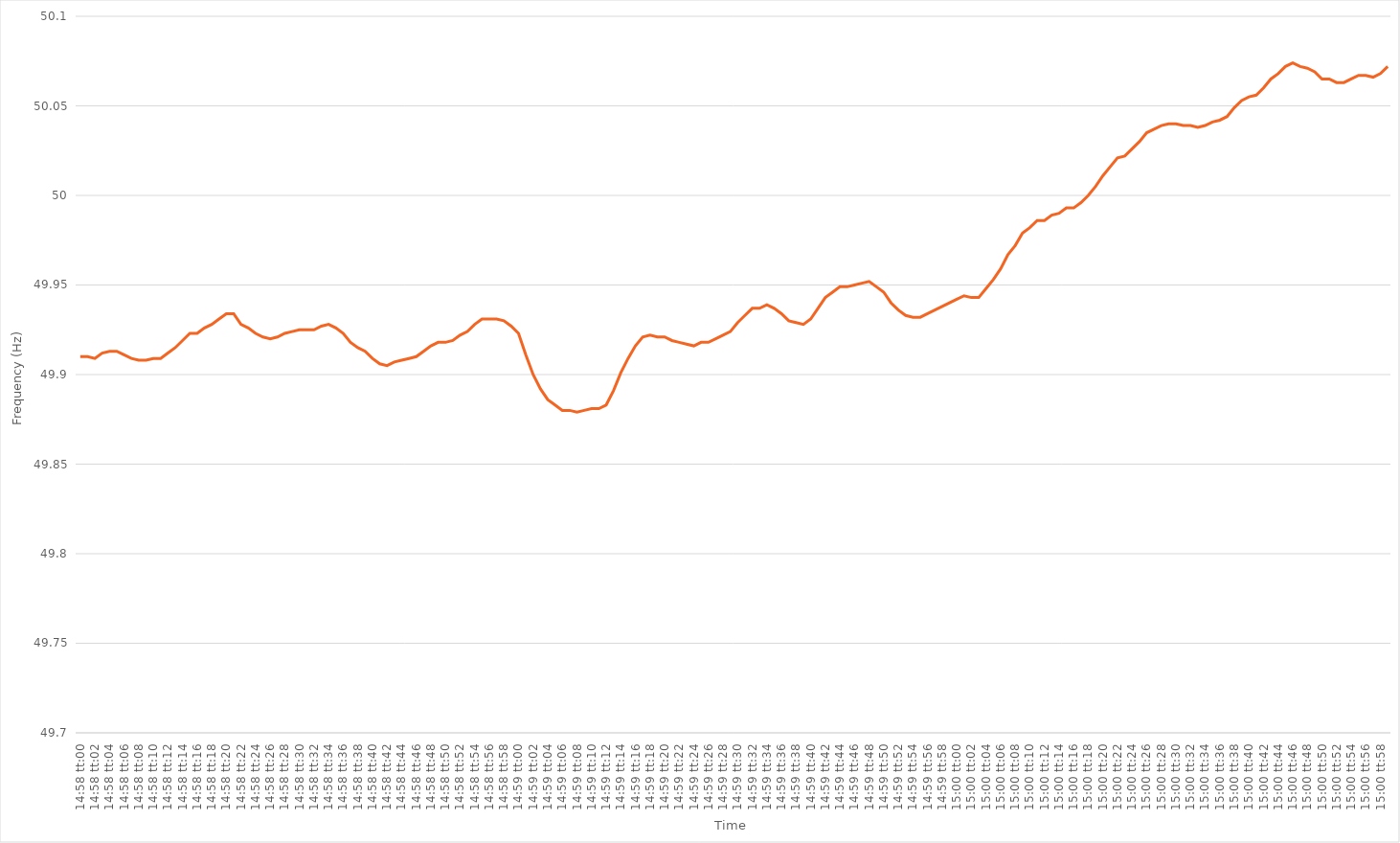
| Category | Series 0 |
|---|---|
| 0.6236111111111111 | 49.91 |
| 0.6236226851851852 | 49.91 |
| 0.6236342592592593 | 49.909 |
| 0.6236458333333333 | 49.912 |
| 0.6236574074074074 | 49.913 |
| 0.6236689814814814 | 49.913 |
| 0.6236805555555556 | 49.911 |
| 0.6236921296296296 | 49.909 |
| 0.6237037037037038 | 49.908 |
| 0.6237152777777778 | 49.908 |
| 0.6237268518518518 | 49.909 |
| 0.6237384259259259 | 49.909 |
| 0.62375 | 49.912 |
| 0.6237615740740741 | 49.915 |
| 0.6237731481481482 | 49.919 |
| 0.6237847222222223 | 49.923 |
| 0.6237962962962963 | 49.923 |
| 0.6238078703703703 | 49.926 |
| 0.6238194444444444 | 49.928 |
| 0.6238310185185185 | 49.931 |
| 0.6238425925925926 | 49.934 |
| 0.6238541666666667 | 49.934 |
| 0.6238657407407407 | 49.928 |
| 0.6238773148148148 | 49.926 |
| 0.6238888888888888 | 49.923 |
| 0.623900462962963 | 49.921 |
| 0.623912037037037 | 49.92 |
| 0.6239236111111112 | 49.921 |
| 0.6239351851851852 | 49.923 |
| 0.6239467592592592 | 49.924 |
| 0.6239583333333333 | 49.925 |
| 0.6239699074074074 | 49.925 |
| 0.6239814814814815 | 49.925 |
| 0.6239930555555556 | 49.927 |
| 0.6240046296296297 | 49.928 |
| 0.6240162037037037 | 49.926 |
| 0.6240277777777777 | 49.923 |
| 0.6240393518518519 | 49.918 |
| 0.6240509259259259 | 49.915 |
| 0.6240625 | 49.913 |
| 0.6240740740740741 | 49.909 |
| 0.6240856481481482 | 49.906 |
| 0.6240972222222222 | 49.905 |
| 0.6241087962962962 | 49.907 |
| 0.6241203703703704 | 49.908 |
| 0.6241319444444444 | 49.909 |
| 0.6241435185185186 | 49.91 |
| 0.6241550925925926 | 49.913 |
| 0.6241666666666666 | 49.916 |
| 0.6241782407407407 | 49.918 |
| 0.6241898148148148 | 49.918 |
| 0.6242013888888889 | 49.919 |
| 0.624212962962963 | 49.922 |
| 0.6242245370370371 | 49.924 |
| 0.6242361111111111 | 49.928 |
| 0.6242476851851851 | 49.931 |
| 0.6242592592592593 | 49.931 |
| 0.6242708333333333 | 49.931 |
| 0.6242824074074075 | 49.93 |
| 0.6242939814814815 | 49.927 |
| 0.6243055555555556 | 49.923 |
| 0.6243171296296296 | 49.911 |
| 0.6243287037037036 | 49.9 |
| 0.6243402777777778 | 49.892 |
| 0.6243518518518518 | 49.886 |
| 0.624363425925926 | 49.883 |
| 0.624375 | 49.88 |
| 0.624386574074074 | 49.88 |
| 0.6243981481481481 | 49.879 |
| 0.6244097222222222 | 49.88 |
| 0.6244212962962963 | 49.881 |
| 0.6244328703703704 | 49.881 |
| 0.6244444444444445 | 49.883 |
| 0.6244560185185185 | 49.891 |
| 0.6244675925925925 | 49.901 |
| 0.6244791666666667 | 49.909 |
| 0.6244907407407407 | 49.916 |
| 0.6245023148148149 | 49.921 |
| 0.6245138888888889 | 49.922 |
| 0.624525462962963 | 49.921 |
| 0.624537037037037 | 49.921 |
| 0.624548611111111 | 49.919 |
| 0.6245601851851852 | 49.918 |
| 0.6245717592592592 | 49.917 |
| 0.6245833333333334 | 49.916 |
| 0.6245949074074074 | 49.918 |
| 0.6246064814814815 | 49.918 |
| 0.6246180555555555 | 49.92 |
| 0.6246296296296296 | 49.922 |
| 0.6246412037037037 | 49.924 |
| 0.6246527777777778 | 49.929 |
| 0.6246643518518519 | 49.933 |
| 0.6246759259259259 | 49.937 |
| 0.6246875 | 49.937 |
| 0.6246990740740741 | 49.939 |
| 0.6247106481481481 | 49.937 |
| 0.6247222222222223 | 49.934 |
| 0.6247337962962963 | 49.93 |
| 0.6247453703703704 | 49.929 |
| 0.6247569444444444 | 49.928 |
| 0.6247685185185184 | 49.931 |
| 0.6247800925925926 | 49.937 |
| 0.6247916666666666 | 49.943 |
| 0.6248032407407408 | 49.946 |
| 0.6248148148148148 | 49.949 |
| 0.6248263888888889 | 49.949 |
| 0.6248379629629629 | 49.95 |
| 0.624849537037037 | 49.951 |
| 0.6248611111111111 | 49.952 |
| 0.6248726851851852 | 49.949 |
| 0.6248842592592593 | 49.946 |
| 0.6248958333333333 | 49.94 |
| 0.6249074074074074 | 49.936 |
| 0.6249189814814815 | 49.933 |
| 0.6249305555555555 | 49.932 |
| 0.6249421296296297 | 49.932 |
| 0.6249537037037037 | 49.934 |
| 0.6249652777777778 | 49.936 |
| 0.6249768518518518 | 49.938 |
| 0.624988425925926 | 49.94 |
| 0.625 | 49.942 |
| 0.625011574074074 | 49.944 |
| 0.6250231481481482 | 49.943 |
| 0.6250347222222222 | 49.943 |
| 0.6250462962962963 | 49.948 |
| 0.6250578703703703 | 49.953 |
| 0.6250694444444445 | 49.959 |
| 0.6250810185185185 | 49.967 |
| 0.6250925925925926 | 49.972 |
| 0.6251041666666667 | 49.979 |
| 0.6251157407407407 | 49.982 |
| 0.6251273148148148 | 49.986 |
| 0.6251388888888889 | 49.986 |
| 0.625150462962963 | 49.989 |
| 0.6251620370370371 | 49.99 |
| 0.6251736111111111 | 49.993 |
| 0.6251851851851852 | 49.993 |
| 0.6251967592592592 | 49.996 |
| 0.6252083333333334 | 50 |
| 0.6252199074074074 | 50.005 |
| 0.6252314814814816 | 50.011 |
| 0.6252430555555556 | 50.016 |
| 0.6252546296296296 | 50.021 |
| 0.6252662037037037 | 50.022 |
| 0.6252777777777777 | 50.026 |
| 0.6252893518518519 | 50.03 |
| 0.6253009259259259 | 50.035 |
| 0.6253125 | 50.037 |
| 0.6253240740740741 | 50.039 |
| 0.6253356481481481 | 50.04 |
| 0.6253472222222222 | 50.04 |
| 0.6253587962962963 | 50.039 |
| 0.6253703703703704 | 50.039 |
| 0.6253819444444445 | 50.038 |
| 0.6253935185185185 | 50.039 |
| 0.6254050925925926 | 50.041 |
| 0.6254166666666666 | 50.042 |
| 0.6254282407407408 | 50.044 |
| 0.6254398148148148 | 50.049 |
| 0.625451388888889 | 50.053 |
| 0.625462962962963 | 50.055 |
| 0.625474537037037 | 50.056 |
| 0.6254861111111111 | 50.06 |
| 0.6254976851851851 | 50.065 |
| 0.6255092592592593 | 50.068 |
| 0.6255208333333333 | 50.072 |
| 0.6255324074074075 | 50.074 |
| 0.6255439814814815 | 50.072 |
| 0.6255555555555555 | 50.071 |
| 0.6255671296296296 | 50.069 |
| 0.6255787037037037 | 50.065 |
| 0.6255902777777778 | 50.065 |
| 0.6256018518518519 | 50.063 |
| 0.625613425925926 | 50.063 |
| 0.625625 | 50.065 |
| 0.625636574074074 | 50.067 |
| 0.6256481481481482 | 50.067 |
| 0.6256597222222222 | 50.066 |
| 0.6256712962962964 | 50.068 |
| 0.6256828703703704 | 50.072 |